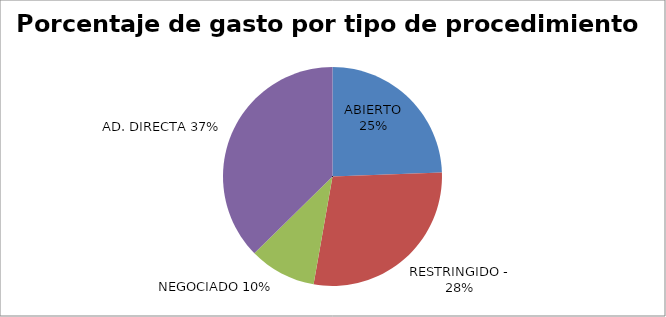
| Category | lll | Series 1 |
|---|---|---|
| ABIERTO | 4531281.03 |  |
|  | 5258379.28 |  |
|  | 1833934.49 |  |